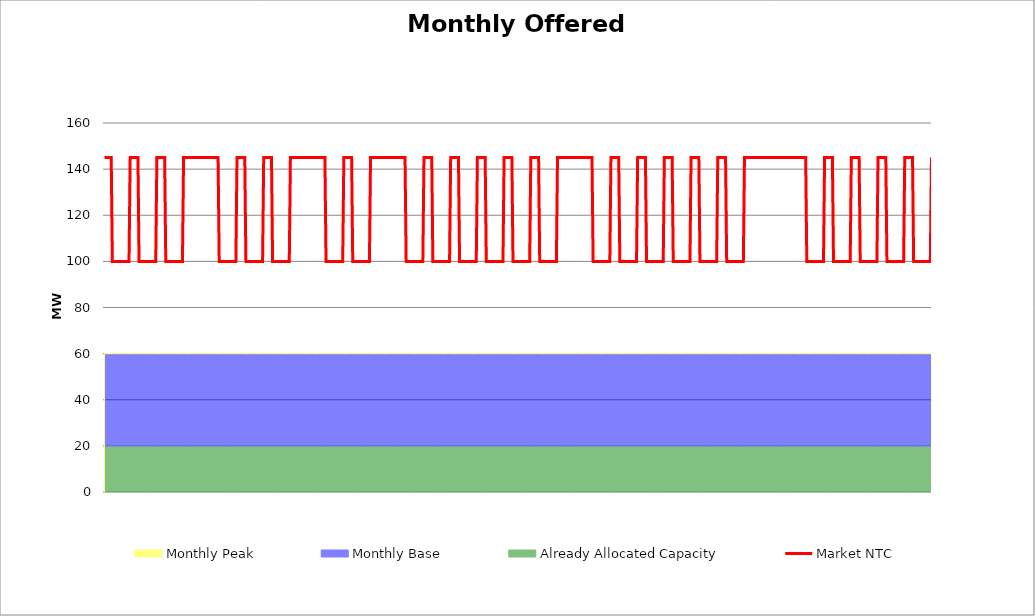
| Category | Market NTC |
|---|---|
| 0 | 145 |
| 1 | 145 |
| 2 | 145 |
| 3 | 145 |
| 4 | 145 |
| 5 | 145 |
| 6 | 145 |
| 7 | 100 |
| 8 | 100 |
| 9 | 100 |
| 10 | 100 |
| 11 | 100 |
| 12 | 100 |
| 13 | 100 |
| 14 | 100 |
| 15 | 100 |
| 16 | 100 |
| 17 | 100 |
| 18 | 100 |
| 19 | 100 |
| 20 | 100 |
| 21 | 100 |
| 22 | 100 |
| 23 | 145 |
| 24 | 145 |
| 25 | 145 |
| 26 | 145 |
| 27 | 145 |
| 28 | 145 |
| 29 | 145 |
| 30 | 145 |
| 31 | 100 |
| 32 | 100 |
| 33 | 100 |
| 34 | 100 |
| 35 | 100 |
| 36 | 100 |
| 37 | 100 |
| 38 | 100 |
| 39 | 100 |
| 40 | 100 |
| 41 | 100 |
| 42 | 100 |
| 43 | 100 |
| 44 | 100 |
| 45 | 100 |
| 46 | 100 |
| 47 | 145 |
| 48 | 145 |
| 49 | 145 |
| 50 | 145 |
| 51 | 145 |
| 52 | 145 |
| 53 | 145 |
| 54 | 145 |
| 55 | 100 |
| 56 | 100 |
| 57 | 100 |
| 58 | 100 |
| 59 | 100 |
| 60 | 100 |
| 61 | 100 |
| 62 | 100 |
| 63 | 100 |
| 64 | 100 |
| 65 | 100 |
| 66 | 100 |
| 67 | 100 |
| 68 | 100 |
| 69 | 100 |
| 70 | 100 |
| 71 | 145 |
| 72 | 145 |
| 73 | 145 |
| 74 | 145 |
| 75 | 145 |
| 76 | 145 |
| 77 | 145 |
| 78 | 145 |
| 79 | 145 |
| 80 | 145 |
| 81 | 145 |
| 82 | 145 |
| 83 | 145 |
| 84 | 145 |
| 85 | 145 |
| 86 | 145 |
| 87 | 145 |
| 88 | 145 |
| 89 | 145 |
| 90 | 145 |
| 91 | 145 |
| 92 | 145 |
| 93 | 145 |
| 94 | 145 |
| 95 | 145 |
| 96 | 145 |
| 97 | 145 |
| 98 | 145 |
| 99 | 145 |
| 100 | 145 |
| 101 | 145 |
| 102 | 145 |
| 103 | 100 |
| 104 | 100 |
| 105 | 100 |
| 106 | 100 |
| 107 | 100 |
| 108 | 100 |
| 109 | 100 |
| 110 | 100 |
| 111 | 100 |
| 112 | 100 |
| 113 | 100 |
| 114 | 100 |
| 115 | 100 |
| 116 | 100 |
| 117 | 100 |
| 118 | 100 |
| 119 | 145 |
| 120 | 145 |
| 121 | 145 |
| 122 | 145 |
| 123 | 145 |
| 124 | 145 |
| 125 | 145 |
| 126 | 145 |
| 127 | 100 |
| 128 | 100 |
| 129 | 100 |
| 130 | 100 |
| 131 | 100 |
| 132 | 100 |
| 133 | 100 |
| 134 | 100 |
| 135 | 100 |
| 136 | 100 |
| 137 | 100 |
| 138 | 100 |
| 139 | 100 |
| 140 | 100 |
| 141 | 100 |
| 142 | 100 |
| 143 | 145 |
| 144 | 145 |
| 145 | 145 |
| 146 | 145 |
| 147 | 145 |
| 148 | 145 |
| 149 | 145 |
| 150 | 145 |
| 151 | 100 |
| 152 | 100 |
| 153 | 100 |
| 154 | 100 |
| 155 | 100 |
| 156 | 100 |
| 157 | 100 |
| 158 | 100 |
| 159 | 100 |
| 160 | 100 |
| 161 | 100 |
| 162 | 100 |
| 163 | 100 |
| 164 | 100 |
| 165 | 100 |
| 166 | 100 |
| 167 | 145 |
| 168 | 145 |
| 169 | 145 |
| 170 | 145 |
| 171 | 145 |
| 172 | 145 |
| 173 | 145 |
| 174 | 145 |
| 175 | 145 |
| 176 | 145 |
| 177 | 145 |
| 178 | 145 |
| 179 | 145 |
| 180 | 145 |
| 181 | 145 |
| 182 | 145 |
| 183 | 145 |
| 184 | 145 |
| 185 | 145 |
| 186 | 145 |
| 187 | 145 |
| 188 | 145 |
| 189 | 145 |
| 190 | 145 |
| 191 | 145 |
| 192 | 145 |
| 193 | 145 |
| 194 | 145 |
| 195 | 145 |
| 196 | 145 |
| 197 | 145 |
| 198 | 145 |
| 199 | 100 |
| 200 | 100 |
| 201 | 100 |
| 202 | 100 |
| 203 | 100 |
| 204 | 100 |
| 205 | 100 |
| 206 | 100 |
| 207 | 100 |
| 208 | 100 |
| 209 | 100 |
| 210 | 100 |
| 211 | 100 |
| 212 | 100 |
| 213 | 100 |
| 214 | 100 |
| 215 | 145 |
| 216 | 145 |
| 217 | 145 |
| 218 | 145 |
| 219 | 145 |
| 220 | 145 |
| 221 | 145 |
| 222 | 145 |
| 223 | 100 |
| 224 | 100 |
| 225 | 100 |
| 226 | 100 |
| 227 | 100 |
| 228 | 100 |
| 229 | 100 |
| 230 | 100 |
| 231 | 100 |
| 232 | 100 |
| 233 | 100 |
| 234 | 100 |
| 235 | 100 |
| 236 | 100 |
| 237 | 100 |
| 238 | 100 |
| 239 | 145 |
| 240 | 145 |
| 241 | 145 |
| 242 | 145 |
| 243 | 145 |
| 244 | 145 |
| 245 | 145 |
| 246 | 145 |
| 247 | 145 |
| 248 | 145 |
| 249 | 145 |
| 250 | 145 |
| 251 | 145 |
| 252 | 145 |
| 253 | 145 |
| 254 | 145 |
| 255 | 145 |
| 256 | 145 |
| 257 | 145 |
| 258 | 145 |
| 259 | 145 |
| 260 | 145 |
| 261 | 145 |
| 262 | 145 |
| 263 | 145 |
| 264 | 145 |
| 265 | 145 |
| 266 | 145 |
| 267 | 145 |
| 268 | 145 |
| 269 | 145 |
| 270 | 145 |
| 271 | 100 |
| 272 | 100 |
| 273 | 100 |
| 274 | 100 |
| 275 | 100 |
| 276 | 100 |
| 277 | 100 |
| 278 | 100 |
| 279 | 100 |
| 280 | 100 |
| 281 | 100 |
| 282 | 100 |
| 283 | 100 |
| 284 | 100 |
| 285 | 100 |
| 286 | 100 |
| 287 | 145 |
| 288 | 145 |
| 289 | 145 |
| 290 | 145 |
| 291 | 145 |
| 292 | 145 |
| 293 | 145 |
| 294 | 145 |
| 295 | 100 |
| 296 | 100 |
| 297 | 100 |
| 298 | 100 |
| 299 | 100 |
| 300 | 100 |
| 301 | 100 |
| 302 | 100 |
| 303 | 100 |
| 304 | 100 |
| 305 | 100 |
| 306 | 100 |
| 307 | 100 |
| 308 | 100 |
| 309 | 100 |
| 310 | 100 |
| 311 | 145 |
| 312 | 145 |
| 313 | 145 |
| 314 | 145 |
| 315 | 145 |
| 316 | 145 |
| 317 | 145 |
| 318 | 145 |
| 319 | 100 |
| 320 | 100 |
| 321 | 100 |
| 322 | 100 |
| 323 | 100 |
| 324 | 100 |
| 325 | 100 |
| 326 | 100 |
| 327 | 100 |
| 328 | 100 |
| 329 | 100 |
| 330 | 100 |
| 331 | 100 |
| 332 | 100 |
| 333 | 100 |
| 334 | 100 |
| 335 | 145 |
| 336 | 145 |
| 337 | 145 |
| 338 | 145 |
| 339 | 145 |
| 340 | 145 |
| 341 | 145 |
| 342 | 145 |
| 343 | 100 |
| 344 | 100 |
| 345 | 100 |
| 346 | 100 |
| 347 | 100 |
| 348 | 100 |
| 349 | 100 |
| 350 | 100 |
| 351 | 100 |
| 352 | 100 |
| 353 | 100 |
| 354 | 100 |
| 355 | 100 |
| 356 | 100 |
| 357 | 100 |
| 358 | 100 |
| 359 | 145 |
| 360 | 145 |
| 361 | 145 |
| 362 | 145 |
| 363 | 145 |
| 364 | 145 |
| 365 | 145 |
| 366 | 145 |
| 367 | 100 |
| 368 | 100 |
| 369 | 100 |
| 370 | 100 |
| 371 | 100 |
| 372 | 100 |
| 373 | 100 |
| 374 | 100 |
| 375 | 100 |
| 376 | 100 |
| 377 | 100 |
| 378 | 100 |
| 379 | 100 |
| 380 | 100 |
| 381 | 100 |
| 382 | 100 |
| 383 | 145 |
| 384 | 145 |
| 385 | 145 |
| 386 | 145 |
| 387 | 145 |
| 388 | 145 |
| 389 | 145 |
| 390 | 145 |
| 391 | 100 |
| 392 | 100 |
| 393 | 100 |
| 394 | 100 |
| 395 | 100 |
| 396 | 100 |
| 397 | 100 |
| 398 | 100 |
| 399 | 100 |
| 400 | 100 |
| 401 | 100 |
| 402 | 100 |
| 403 | 100 |
| 404 | 100 |
| 405 | 100 |
| 406 | 100 |
| 407 | 145 |
| 408 | 145 |
| 409 | 145 |
| 410 | 145 |
| 411 | 145 |
| 412 | 145 |
| 413 | 145 |
| 414 | 145 |
| 415 | 145 |
| 416 | 145 |
| 417 | 145 |
| 418 | 145 |
| 419 | 145 |
| 420 | 145 |
| 421 | 145 |
| 422 | 145 |
| 423 | 145 |
| 424 | 145 |
| 425 | 145 |
| 426 | 145 |
| 427 | 145 |
| 428 | 145 |
| 429 | 145 |
| 430 | 145 |
| 431 | 145 |
| 432 | 145 |
| 433 | 145 |
| 434 | 145 |
| 435 | 145 |
| 436 | 145 |
| 437 | 145 |
| 438 | 145 |
| 439 | 100 |
| 440 | 100 |
| 441 | 100 |
| 442 | 100 |
| 443 | 100 |
| 444 | 100 |
| 445 | 100 |
| 446 | 100 |
| 447 | 100 |
| 448 | 100 |
| 449 | 100 |
| 450 | 100 |
| 451 | 100 |
| 452 | 100 |
| 453 | 100 |
| 454 | 100 |
| 455 | 145 |
| 456 | 145 |
| 457 | 145 |
| 458 | 145 |
| 459 | 145 |
| 460 | 145 |
| 461 | 145 |
| 462 | 145 |
| 463 | 100 |
| 464 | 100 |
| 465 | 100 |
| 466 | 100 |
| 467 | 100 |
| 468 | 100 |
| 469 | 100 |
| 470 | 100 |
| 471 | 100 |
| 472 | 100 |
| 473 | 100 |
| 474 | 100 |
| 475 | 100 |
| 476 | 100 |
| 477 | 100 |
| 478 | 100 |
| 479 | 145 |
| 480 | 145 |
| 481 | 145 |
| 482 | 145 |
| 483 | 145 |
| 484 | 145 |
| 485 | 145 |
| 486 | 145 |
| 487 | 100 |
| 488 | 100 |
| 489 | 100 |
| 490 | 100 |
| 491 | 100 |
| 492 | 100 |
| 493 | 100 |
| 494 | 100 |
| 495 | 100 |
| 496 | 100 |
| 497 | 100 |
| 498 | 100 |
| 499 | 100 |
| 500 | 100 |
| 501 | 100 |
| 502 | 100 |
| 503 | 145 |
| 504 | 145 |
| 505 | 145 |
| 506 | 145 |
| 507 | 145 |
| 508 | 145 |
| 509 | 145 |
| 510 | 145 |
| 511 | 100 |
| 512 | 100 |
| 513 | 100 |
| 514 | 100 |
| 515 | 100 |
| 516 | 100 |
| 517 | 100 |
| 518 | 100 |
| 519 | 100 |
| 520 | 100 |
| 521 | 100 |
| 522 | 100 |
| 523 | 100 |
| 524 | 100 |
| 525 | 100 |
| 526 | 100 |
| 527 | 145 |
| 528 | 145 |
| 529 | 145 |
| 530 | 145 |
| 531 | 145 |
| 532 | 145 |
| 533 | 145 |
| 534 | 145 |
| 535 | 100 |
| 536 | 100 |
| 537 | 100 |
| 538 | 100 |
| 539 | 100 |
| 540 | 100 |
| 541 | 100 |
| 542 | 100 |
| 543 | 100 |
| 544 | 100 |
| 545 | 100 |
| 546 | 100 |
| 547 | 100 |
| 548 | 100 |
| 549 | 100 |
| 550 | 100 |
| 551 | 145 |
| 552 | 145 |
| 553 | 145 |
| 554 | 145 |
| 555 | 145 |
| 556 | 145 |
| 557 | 145 |
| 558 | 145 |
| 559 | 100 |
| 560 | 100 |
| 561 | 100 |
| 562 | 100 |
| 563 | 100 |
| 564 | 100 |
| 565 | 100 |
| 566 | 100 |
| 567 | 100 |
| 568 | 100 |
| 569 | 100 |
| 570 | 100 |
| 571 | 100 |
| 572 | 100 |
| 573 | 100 |
| 574 | 100 |
| 575 | 145 |
| 576 | 145 |
| 577 | 145 |
| 578 | 145 |
| 579 | 145 |
| 580 | 145 |
| 581 | 145 |
| 582 | 145 |
| 583 | 145 |
| 584 | 145 |
| 585 | 145 |
| 586 | 145 |
| 587 | 145 |
| 588 | 145 |
| 589 | 145 |
| 590 | 145 |
| 591 | 145 |
| 592 | 145 |
| 593 | 145 |
| 594 | 145 |
| 595 | 145 |
| 596 | 145 |
| 597 | 145 |
| 598 | 145 |
| 599 | 145 |
| 600 | 145 |
| 601 | 145 |
| 602 | 145 |
| 603 | 145 |
| 604 | 145 |
| 605 | 145 |
| 606 | 145 |
| 607 | 145 |
| 608 | 145 |
| 609 | 145 |
| 610 | 145 |
| 611 | 145 |
| 612 | 145 |
| 613 | 145 |
| 614 | 145 |
| 615 | 145 |
| 616 | 145 |
| 617 | 145 |
| 618 | 145 |
| 619 | 145 |
| 620 | 145 |
| 621 | 145 |
| 622 | 145 |
| 623 | 145 |
| 624 | 145 |
| 625 | 145 |
| 626 | 145 |
| 627 | 145 |
| 628 | 145 |
| 629 | 145 |
| 630 | 145 |
| 631 | 100 |
| 632 | 100 |
| 633 | 100 |
| 634 | 100 |
| 635 | 100 |
| 636 | 100 |
| 637 | 100 |
| 638 | 100 |
| 639 | 100 |
| 640 | 100 |
| 641 | 100 |
| 642 | 100 |
| 643 | 100 |
| 644 | 100 |
| 645 | 100 |
| 646 | 100 |
| 647 | 145 |
| 648 | 145 |
| 649 | 145 |
| 650 | 145 |
| 651 | 145 |
| 652 | 145 |
| 653 | 145 |
| 654 | 145 |
| 655 | 100 |
| 656 | 100 |
| 657 | 100 |
| 658 | 100 |
| 659 | 100 |
| 660 | 100 |
| 661 | 100 |
| 662 | 100 |
| 663 | 100 |
| 664 | 100 |
| 665 | 100 |
| 666 | 100 |
| 667 | 100 |
| 668 | 100 |
| 669 | 100 |
| 670 | 100 |
| 671 | 145 |
| 672 | 145 |
| 673 | 145 |
| 674 | 145 |
| 675 | 145 |
| 676 | 145 |
| 677 | 145 |
| 678 | 145 |
| 679 | 100 |
| 680 | 100 |
| 681 | 100 |
| 682 | 100 |
| 683 | 100 |
| 684 | 100 |
| 685 | 100 |
| 686 | 100 |
| 687 | 100 |
| 688 | 100 |
| 689 | 100 |
| 690 | 100 |
| 691 | 100 |
| 692 | 100 |
| 693 | 100 |
| 694 | 100 |
| 695 | 145 |
| 696 | 145 |
| 697 | 145 |
| 698 | 145 |
| 699 | 145 |
| 700 | 145 |
| 701 | 145 |
| 702 | 145 |
| 703 | 100 |
| 704 | 100 |
| 705 | 100 |
| 706 | 100 |
| 707 | 100 |
| 708 | 100 |
| 709 | 100 |
| 710 | 100 |
| 711 | 100 |
| 712 | 100 |
| 713 | 100 |
| 714 | 100 |
| 715 | 100 |
| 716 | 100 |
| 717 | 100 |
| 718 | 100 |
| 719 | 145 |
| 720 | 145 |
| 721 | 145 |
| 722 | 145 |
| 723 | 145 |
| 724 | 145 |
| 725 | 145 |
| 726 | 145 |
| 727 | 100 |
| 728 | 100 |
| 729 | 100 |
| 730 | 100 |
| 731 | 100 |
| 732 | 100 |
| 733 | 100 |
| 734 | 100 |
| 735 | 100 |
| 736 | 100 |
| 737 | 100 |
| 738 | 100 |
| 739 | 100 |
| 740 | 100 |
| 741 | 100 |
| 742 | 100 |
| 743 | 145 |